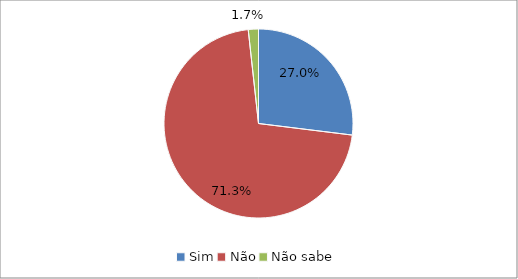
| Category | Series 0 |
|---|---|
| Sim | 0.27 |
| Não | 0.713 |
| Não sabe | 0.017 |